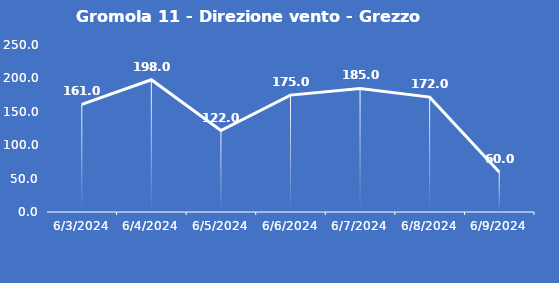
| Category | Gromola 11 - Direzione vento - Grezzo (°N) |
|---|---|
| 6/3/24 | 161 |
| 6/4/24 | 198 |
| 6/5/24 | 122 |
| 6/6/24 | 175 |
| 6/7/24 | 185 |
| 6/8/24 | 172 |
| 6/9/24 | 60 |